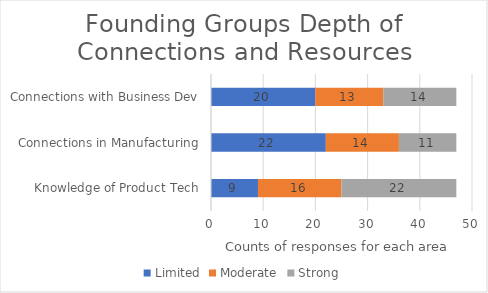
| Category | Limited | Moderate | Strong |
|---|---|---|---|
| Knowledge of Product Tech | 9 | 16 | 22 |
| Connections in Manufacturing | 22 | 14 | 11 |
| Connections with Business Dev | 20 | 13 | 14 |